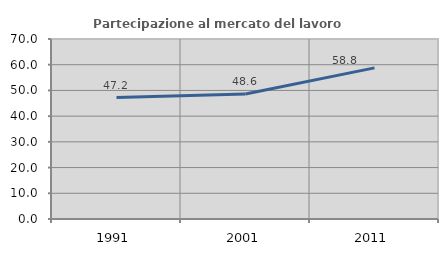
| Category | Partecipazione al mercato del lavoro  femminile |
|---|---|
| 1991.0 | 47.242 |
| 2001.0 | 48.609 |
| 2011.0 | 58.764 |